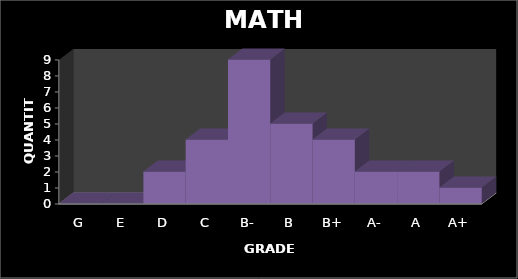
| Category | QUANTITY |
|---|---|
| G | 0 |
| E | 0 |
| D | 2 |
| C | 4 |
| B- | 9 |
| B | 5 |
| B+ | 4 |
| A- | 2 |
| A | 2 |
| A+ | 1 |